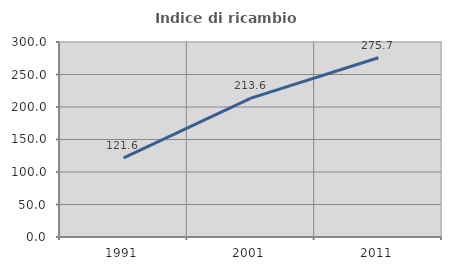
| Category | Indice di ricambio occupazionale  |
|---|---|
| 1991.0 | 121.569 |
| 2001.0 | 213.636 |
| 2011.0 | 275.701 |